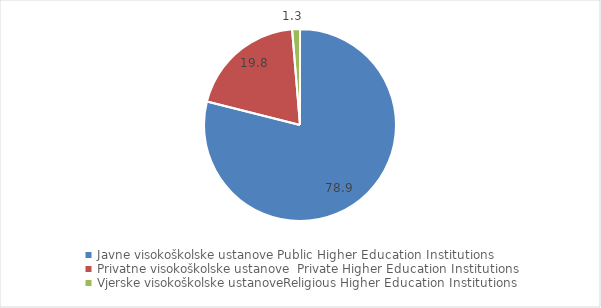
| Category | 2021/2022 |
|---|---|
| Javne visokoškolske ustanove Public Higher Education Institutions | 78.928 |
| Privatne visokoškolske ustanove  Private Higher Education Institutions | 19.756 |
| Vjerske visokoškolske ustanoveReligious Higher Education Institutions | 1.316 |